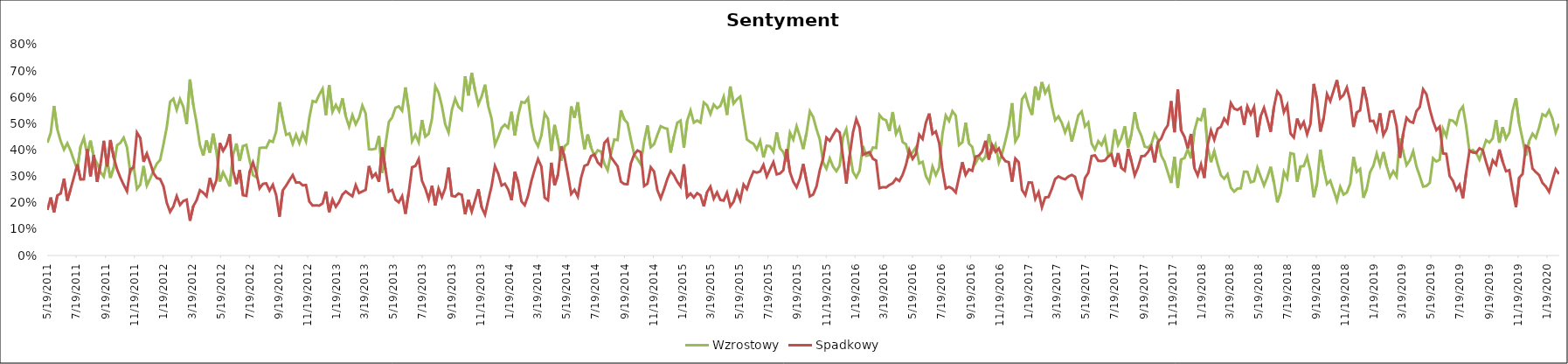
| Category | Wzrostowy | Spadkowy |
|---|---|---|
| 5/19/11 | 0.428 | 0.173 |
| 5/26/11 | 0.465 | 0.22 |
| 6/2/11 | 0.567 | 0.164 |
| 6/9/11 | 0.478 | 0.228 |
| 6/16/11 | 0.434 | 0.235 |
| 6/23/11 | 0.402 | 0.291 |
| 6/30/11 | 0.426 | 0.208 |
| 7/7/11 | 0.397 | 0.252 |
| 7/14/11 | 0.36 | 0.297 |
| 7/21/11 | 0.327 | 0.346 |
| 7/28/11 | 0.413 | 0.288 |
| 8/4/11 | 0.446 | 0.289 |
| 8/11/11 | 0.382 | 0.403 |
| 8/18/11 | 0.436 | 0.3 |
| 8/25/11 | 0.372 | 0.38 |
| 9/1/11 | 0.349 | 0.279 |
| 9/8/11 | 0.317 | 0.345 |
| 9/15/11 | 0.299 | 0.435 |
| 9/22/11 | 0.358 | 0.338 |
| 9/29/11 | 0.295 | 0.438 |
| 10/6/11 | 0.333 | 0.372 |
| 10/13/11 | 0.418 | 0.328 |
| 10/20/11 | 0.427 | 0.295 |
| 10/27/11 | 0.447 | 0.268 |
| 11/3/11 | 0.41 | 0.244 |
| 11/10/11 | 0.315 | 0.327 |
| 11/17/11 | 0.34 | 0.334 |
| 11/24/11 | 0.252 | 0.466 |
| 12/1/11 | 0.269 | 0.446 |
| 12/8/11 | 0.34 | 0.355 |
| 12/15/11 | 0.265 | 0.387 |
| 12/22/11 | 0.292 | 0.351 |
| 12/29/11 | 0.322 | 0.312 |
| 1/5/12 | 0.348 | 0.294 |
| 1/12/12 | 0.363 | 0.29 |
| 1/19/12 | 0.422 | 0.263 |
| 1/26/12 | 0.487 | 0.2 |
| 2/2/12 | 0.583 | 0.166 |
| 2/9/12 | 0.595 | 0.186 |
| 2/16/12 | 0.553 | 0.225 |
| 2/23/12 | 0.593 | 0.192 |
| 3/1/12 | 0.564 | 0.207 |
| 3/8/12 | 0.498 | 0.212 |
| 3/15/12 | 0.668 | 0.132 |
| 3/22/12 | 0.571 | 0.187 |
| 3/29/12 | 0.503 | 0.21 |
| 4/5/12 | 0.419 | 0.248 |
| 4/12/12 | 0.379 | 0.238 |
| 4/19/12 | 0.436 | 0.225 |
| 4/26/12 | 0.39 | 0.294 |
| 5/3/12 | 0.462 | 0.252 |
| 5/10/12 | 0.393 | 0.286 |
| 5/17/12 | 0.28 | 0.427 |
| 5/24/12 | 0.316 | 0.397 |
| 5/31/12 | 0.291 | 0.419 |
| 6/7/12 | 0.262 | 0.46 |
| 6/14/12 | 0.382 | 0.324 |
| 6/21/12 | 0.425 | 0.271 |
| 6/28/12 | 0.359 | 0.324 |
| 7/5/12 | 0.415 | 0.229 |
| 7/12/12 | 0.42 | 0.226 |
| 7/19/12 | 0.36 | 0.318 |
| 7/26/12 | 0.305 | 0.353 |
| 8/2/12 | 0.297 | 0.314 |
| 8/9/12 | 0.408 | 0.255 |
| 8/16/12 | 0.409 | 0.272 |
| 8/23/12 | 0.409 | 0.274 |
| 8/30/12 | 0.436 | 0.246 |
| 9/6/12 | 0.431 | 0.268 |
| 9/13/12 | 0.47 | 0.229 |
| 9/20/12 | 0.582 | 0.147 |
| 9/27/12 | 0.517 | 0.247 |
| 10/4/12 | 0.458 | 0.265 |
| 10/11/12 | 0.463 | 0.286 |
| 10/18/12 | 0.424 | 0.305 |
| 10/25/12 | 0.458 | 0.277 |
| 11/1/12 | 0.426 | 0.278 |
| 11/8/12 | 0.464 | 0.266 |
| 11/15/12 | 0.433 | 0.267 |
| 11/22/12 | 0.522 | 0.205 |
| 11/29/12 | 0.586 | 0.189 |
| 12/6/12 | 0.582 | 0.19 |
| 12/13/12 | 0.61 | 0.189 |
| 12/20/12 | 0.632 | 0.198 |
| 12/27/12 | 0.533 | 0.243 |
| 1/3/13 | 0.647 | 0.165 |
| 1/10/13 | 0.545 | 0.212 |
| 1/17/13 | 0.571 | 0.185 |
| 1/24/13 | 0.548 | 0.203 |
| 1/31/13 | 0.596 | 0.231 |
| 2/7/13 | 0.528 | 0.243 |
| 2/14/13 | 0.489 | 0.233 |
| 2/21/13 | 0.533 | 0.225 |
| 2/28/13 | 0.498 | 0.267 |
| 3/7/13 | 0.522 | 0.237 |
| 3/14/13 | 0.569 | 0.243 |
| 3/21/13 | 0.539 | 0.249 |
| 3/28/13 | 0.403 | 0.34 |
| 4/4/13 | 0.402 | 0.297 |
| 4/11/13 | 0.406 | 0.311 |
| 4/18/13 | 0.453 | 0.28 |
| 4/25/13 | 0.313 | 0.41 |
| 5/2/13 | 0.422 | 0.325 |
| 5/9/13 | 0.507 | 0.242 |
| 5/16/13 | 0.524 | 0.249 |
| 5/23/13 | 0.561 | 0.212 |
| 5/30/13 | 0.566 | 0.202 |
| 6/6/13 | 0.549 | 0.225 |
| 6/13/13 | 0.638 | 0.158 |
| 6/20/13 | 0.553 | 0.24 |
| 6/27/13 | 0.433 | 0.335 |
| 7/4/13 | 0.458 | 0.34 |
| 7/11/13 | 0.429 | 0.366 |
| 7/18/13 | 0.514 | 0.283 |
| 7/25/13 | 0.451 | 0.254 |
| 8/1/13 | 0.462 | 0.214 |
| 8/8/13 | 0.519 | 0.265 |
| 8/15/13 | 0.642 | 0.19 |
| 8/22/13 | 0.618 | 0.253 |
| 8/29/13 | 0.567 | 0.221 |
| 9/5/13 | 0.498 | 0.255 |
| 9/12/13 | 0.467 | 0.333 |
| 9/19/13 | 0.552 | 0.226 |
| 9/26/13 | 0.595 | 0.224 |
| 10/3/13 | 0.564 | 0.235 |
| 10/10/13 | 0.552 | 0.23 |
| 10/17/13 | 0.68 | 0.156 |
| 10/24/13 | 0.607 | 0.211 |
| 10/31/13 | 0.693 | 0.167 |
| 11/7/13 | 0.627 | 0.209 |
| 11/14/13 | 0.573 | 0.252 |
| 11/21/13 | 0.604 | 0.182 |
| 11/28/13 | 0.648 | 0.155 |
| 12/5/13 | 0.566 | 0.211 |
| 12/12/13 | 0.519 | 0.264 |
| 12/19/13 | 0.42 | 0.339 |
| 12/26/13 | 0.45 | 0.31 |
| 1/2/14 | 0.484 | 0.266 |
| 1/9/14 | 0.497 | 0.272 |
| 1/16/14 | 0.484 | 0.25 |
| 1/23/14 | 0.545 | 0.21 |
| 1/30/14 | 0.455 | 0.317 |
| 2/6/14 | 0.531 | 0.278 |
| 2/13/14 | 0.582 | 0.205 |
| 2/20/14 | 0.579 | 0.191 |
| 2/27/14 | 0.597 | 0.227 |
| 3/6/14 | 0.498 | 0.283 |
| 3/13/14 | 0.439 | 0.327 |
| 3/20/14 | 0.415 | 0.366 |
| 3/27/14 | 0.455 | 0.337 |
| 4/3/14 | 0.539 | 0.219 |
| 4/10/14 | 0.519 | 0.21 |
| 4/17/14 | 0.397 | 0.352 |
| 4/24/14 | 0.495 | 0.266 |
| 5/1/14 | 0.437 | 0.306 |
| 5/8/14 | 0.359 | 0.415 |
| 5/15/14 | 0.414 | 0.374 |
| 5/22/14 | 0.425 | 0.307 |
| 5/29/14 | 0.566 | 0.234 |
| 6/5/14 | 0.522 | 0.249 |
| 6/12/14 | 0.581 | 0.224 |
| 6/19/14 | 0.482 | 0.295 |
| 6/26/14 | 0.403 | 0.34 |
| 7/3/14 | 0.459 | 0.345 |
| 7/10/14 | 0.41 | 0.377 |
| 7/17/14 | 0.379 | 0.383 |
| 7/24/14 | 0.399 | 0.353 |
| 7/31/14 | 0.394 | 0.34 |
| 8/7/14 | 0.348 | 0.427 |
| 8/14/14 | 0.324 | 0.441 |
| 8/21/14 | 0.386 | 0.373 |
| 8/28/14 | 0.44 | 0.356 |
| 9/4/14 | 0.438 | 0.338 |
| 9/11/14 | 0.551 | 0.28 |
| 9/18/14 | 0.516 | 0.271 |
| 9/25/14 | 0.502 | 0.271 |
| 10/2/14 | 0.441 | 0.349 |
| 10/9/14 | 0.383 | 0.383 |
| 10/16/14 | 0.366 | 0.398 |
| 10/23/14 | 0.345 | 0.392 |
| 10/30/14 | 0.433 | 0.264 |
| 11/6/14 | 0.494 | 0.272 |
| 11/13/14 | 0.411 | 0.335 |
| 11/20/14 | 0.422 | 0.319 |
| 11/27/14 | 0.457 | 0.248 |
| 12/4/14 | 0.49 | 0.217 |
| 12/11/14 | 0.484 | 0.251 |
| 12/18/14 | 0.481 | 0.29 |
| 12/25/14 | 0.39 | 0.32 |
| 1/1/15 | 0.451 | 0.304 |
| 1/8/15 | 0.503 | 0.28 |
| 1/15/15 | 0.512 | 0.262 |
| 1/22/15 | 0.409 | 0.346 |
| 1/29/15 | 0.511 | 0.222 |
| 2/5/15 | 0.55 | 0.235 |
| 2/12/15 | 0.504 | 0.22 |
| 2/19/15 | 0.512 | 0.236 |
| 2/26/15 | 0.504 | 0.228 |
| 3/5/15 | 0.581 | 0.186 |
| 3/12/15 | 0.57 | 0.241 |
| 3/19/15 | 0.537 | 0.261 |
| 3/26/15 | 0.573 | 0.216 |
| 4/2/15 | 0.559 | 0.239 |
| 4/9/15 | 0.568 | 0.211 |
| 4/16/15 | 0.602 | 0.208 |
| 4/23/15 | 0.533 | 0.238 |
| 4/30/15 | 0.641 | 0.187 |
| 5/7/15 | 0.577 | 0.204 |
| 5/14/15 | 0.593 | 0.243 |
| 5/21/15 | 0.603 | 0.21 |
| 5/28/15 | 0.521 | 0.269 |
| 6/4/15 | 0.44 | 0.252 |
| 6/11/15 | 0.431 | 0.29 |
| 6/18/15 | 0.424 | 0.319 |
| 6/25/15 | 0.403 | 0.314 |
| 7/2/15 | 0.435 | 0.319 |
| 7/9/15 | 0.372 | 0.344 |
| 7/16/15 | 0.416 | 0.3 |
| 7/23/15 | 0.415 | 0.327 |
| 7/30/15 | 0.393 | 0.354 |
| 8/6/15 | 0.467 | 0.308 |
| 8/13/15 | 0.407 | 0.311 |
| 8/20/15 | 0.392 | 0.324 |
| 8/27/15 | 0.357 | 0.403 |
| 9/3/15 | 0.466 | 0.316 |
| 9/10/15 | 0.44 | 0.28 |
| 9/17/15 | 0.49 | 0.259 |
| 9/24/15 | 0.451 | 0.292 |
| 10/1/15 | 0.404 | 0.347 |
| 10/8/15 | 0.466 | 0.283 |
| 10/15/15 | 0.547 | 0.224 |
| 10/22/15 | 0.525 | 0.231 |
| 10/29/15 | 0.479 | 0.262 |
| 11/5/15 | 0.44 | 0.324 |
| 11/12/15 | 0.354 | 0.369 |
| 11/19/15 | 0.329 | 0.447 |
| 11/26/15 | 0.369 | 0.435 |
| 12/3/15 | 0.337 | 0.457 |
| 12/10/15 | 0.32 | 0.478 |
| 12/17/15 | 0.341 | 0.466 |
| 12/24/15 | 0.449 | 0.374 |
| 12/31/15 | 0.479 | 0.273 |
| 1/7/16 | 0.398 | 0.378 |
| 1/14/16 | 0.317 | 0.466 |
| 1/21/16 | 0.297 | 0.517 |
| 1/28/16 | 0.322 | 0.485 |
| 2/4/16 | 0.415 | 0.382 |
| 2/11/16 | 0.378 | 0.388 |
| 2/18/16 | 0.381 | 0.392 |
| 2/25/16 | 0.41 | 0.367 |
| 3/3/16 | 0.408 | 0.36 |
| 3/10/16 | 0.533 | 0.256 |
| 3/17/16 | 0.518 | 0.259 |
| 3/24/16 | 0.513 | 0.258 |
| 3/31/16 | 0.472 | 0.268 |
| 4/7/16 | 0.544 | 0.274 |
| 4/14/16 | 0.461 | 0.292 |
| 4/21/16 | 0.485 | 0.283 |
| 4/28/16 | 0.43 | 0.307 |
| 5/5/16 | 0.422 | 0.343 |
| 5/12/16 | 0.375 | 0.399 |
| 5/19/16 | 0.392 | 0.367 |
| 5/26/16 | 0.411 | 0.386 |
| 6/2/16 | 0.349 | 0.458 |
| 6/9/16 | 0.355 | 0.442 |
| 6/16/16 | 0.302 | 0.504 |
| 6/23/16 | 0.278 | 0.538 |
| 6/30/16 | 0.337 | 0.461 |
| 7/7/16 | 0.305 | 0.471 |
| 7/14/16 | 0.333 | 0.428 |
| 7/21/16 | 0.462 | 0.327 |
| 7/28/16 | 0.531 | 0.254 |
| 8/4/16 | 0.51 | 0.26 |
| 8/11/16 | 0.548 | 0.253 |
| 8/18/16 | 0.531 | 0.239 |
| 8/25/16 | 0.419 | 0.297 |
| 9/1/16 | 0.429 | 0.354 |
| 9/8/16 | 0.504 | 0.306 |
| 9/15/16 | 0.424 | 0.327 |
| 9/22/16 | 0.412 | 0.321 |
| 9/29/16 | 0.351 | 0.375 |
| 10/6/16 | 0.375 | 0.379 |
| 10/13/16 | 0.36 | 0.395 |
| 10/20/16 | 0.375 | 0.435 |
| 10/27/16 | 0.461 | 0.364 |
| 11/3/16 | 0.396 | 0.419 |
| 11/10/16 | 0.421 | 0.394 |
| 11/17/16 | 0.353 | 0.406 |
| 11/24/16 | 0.387 | 0.374 |
| 12/1/16 | 0.436 | 0.358 |
| 12/8/16 | 0.491 | 0.354 |
| 12/15/16 | 0.578 | 0.28 |
| 12/22/16 | 0.433 | 0.368 |
| 12/29/16 | 0.455 | 0.354 |
| 1/5/17 | 0.593 | 0.249 |
| 1/12/17 | 0.611 | 0.229 |
| 1/19/17 | 0.566 | 0.277 |
| 1/26/17 | 0.533 | 0.277 |
| 2/2/17 | 0.641 | 0.215 |
| 2/9/17 | 0.59 | 0.24 |
| 2/16/17 | 0.658 | 0.183 |
| 2/23/17 | 0.616 | 0.22 |
| 3/2/17 | 0.639 | 0.222 |
| 3/9/17 | 0.568 | 0.253 |
| 3/16/17 | 0.513 | 0.29 |
| 3/23/17 | 0.528 | 0.3 |
| 3/30/17 | 0.503 | 0.293 |
| 4/6/17 | 0.467 | 0.289 |
| 4/13/17 | 0.498 | 0.3 |
| 4/20/17 | 0.432 | 0.306 |
| 4/27/17 | 0.481 | 0.298 |
| 5/4/17 | 0.532 | 0.252 |
| 5/11/17 | 0.546 | 0.223 |
| 5/18/17 | 0.49 | 0.294 |
| 5/25/17 | 0.505 | 0.314 |
| 6/1/17 | 0.425 | 0.377 |
| 6/8/17 | 0.402 | 0.38 |
| 6/15/17 | 0.434 | 0.359 |
| 6/22/17 | 0.419 | 0.358 |
| 6/29/17 | 0.447 | 0.361 |
| 7/6/17 | 0.379 | 0.375 |
| 7/13/17 | 0.391 | 0.384 |
| 7/20/17 | 0.479 | 0.336 |
| 7/27/17 | 0.42 | 0.389 |
| 8/3/17 | 0.445 | 0.332 |
| 8/10/17 | 0.49 | 0.322 |
| 8/17/17 | 0.409 | 0.405 |
| 8/24/17 | 0.46 | 0.358 |
| 8/31/17 | 0.544 | 0.304 |
| 9/7/17 | 0.482 | 0.335 |
| 9/14/17 | 0.455 | 0.377 |
| 9/21/17 | 0.413 | 0.378 |
| 9/28/17 | 0.409 | 0.392 |
| 10/5/17 | 0.422 | 0.414 |
| 10/12/17 | 0.462 | 0.353 |
| 10/19/17 | 0.439 | 0.43 |
| 10/26/17 | 0.379 | 0.444 |
| 11/2/17 | 0.355 | 0.475 |
| 11/9/17 | 0.315 | 0.494 |
| 11/16/17 | 0.275 | 0.586 |
| 11/23/17 | 0.375 | 0.467 |
| 11/30/17 | 0.257 | 0.63 |
| 12/7/17 | 0.364 | 0.475 |
| 12/14/17 | 0.369 | 0.451 |
| 12/21/17 | 0.403 | 0.407 |
| 12/28/17 | 0.368 | 0.461 |
| 1/4/18 | 0.473 | 0.332 |
| 1/11/18 | 0.519 | 0.304 |
| 1/18/18 | 0.513 | 0.346 |
| 1/25/18 | 0.559 | 0.294 |
| 2/1/18 | 0.412 | 0.421 |
| 2/8/18 | 0.354 | 0.474 |
| 2/15/18 | 0.396 | 0.439 |
| 2/22/18 | 0.347 | 0.481 |
| 3/1/18 | 0.305 | 0.488 |
| 3/8/18 | 0.291 | 0.52 |
| 3/15/18 | 0.308 | 0.502 |
| 3/22/18 | 0.257 | 0.578 |
| 3/29/18 | 0.242 | 0.557 |
| 4/5/18 | 0.254 | 0.552 |
| 4/12/18 | 0.255 | 0.561 |
| 4/19/18 | 0.318 | 0.496 |
| 4/26/18 | 0.317 | 0.565 |
| 5/3/18 | 0.278 | 0.535 |
| 5/10/18 | 0.282 | 0.564 |
| 5/17/18 | 0.333 | 0.449 |
| 5/24/18 | 0.299 | 0.529 |
| 5/31/18 | 0.266 | 0.56 |
| 6/7/18 | 0.297 | 0.517 |
| 6/14/18 | 0.336 | 0.469 |
| 6/21/18 | 0.277 | 0.562 |
| 6/28/18 | 0.202 | 0.622 |
| 7/5/18 | 0.238 | 0.606 |
| 7/12/18 | 0.317 | 0.543 |
| 7/19/18 | 0.293 | 0.57 |
| 7/26/18 | 0.388 | 0.463 |
| 8/2/18 | 0.385 | 0.448 |
| 8/9/18 | 0.279 | 0.52 |
| 8/16/18 | 0.338 | 0.484 |
| 8/23/18 | 0.339 | 0.507 |
| 8/30/18 | 0.374 | 0.46 |
| 9/6/18 | 0.32 | 0.498 |
| 9/13/18 | 0.221 | 0.651 |
| 9/20/18 | 0.273 | 0.59 |
| 9/27/18 | 0.402 | 0.47 |
| 10/4/18 | 0.329 | 0.521 |
| 10/11/18 | 0.271 | 0.612 |
| 10/18/18 | 0.284 | 0.585 |
| 10/25/18 | 0.247 | 0.626 |
| 11/1/18 | 0.209 | 0.665 |
| 11/8/18 | 0.26 | 0.596 |
| 11/15/18 | 0.231 | 0.609 |
| 11/22/18 | 0.239 | 0.637 |
| 11/29/18 | 0.272 | 0.585 |
| 12/6/18 | 0.374 | 0.487 |
| 12/13/18 | 0.317 | 0.543 |
| 12/20/18 | 0.328 | 0.551 |
| 12/27/18 | 0.219 | 0.639 |
| 1/3/19 | 0.253 | 0.588 |
| 1/10/19 | 0.316 | 0.51 |
| 1/17/19 | 0.341 | 0.511 |
| 1/24/19 | 0.387 | 0.476 |
| 1/31/19 | 0.343 | 0.539 |
| 2/7/19 | 0.392 | 0.457 |
| 2/14/19 | 0.339 | 0.481 |
| 2/21/19 | 0.297 | 0.545 |
| 2/28/19 | 0.32 | 0.548 |
| 3/7/19 | 0.3 | 0.491 |
| 3/14/19 | 0.444 | 0.371 |
| 3/21/19 | 0.394 | 0.463 |
| 3/28/19 | 0.343 | 0.522 |
| 4/4/19 | 0.361 | 0.508 |
| 4/11/19 | 0.396 | 0.504 |
| 4/18/19 | 0.337 | 0.548 |
| 4/25/19 | 0.301 | 0.564 |
| 5/2/19 | 0.261 | 0.631 |
| 5/9/19 | 0.264 | 0.612 |
| 5/16/19 | 0.276 | 0.556 |
| 5/23/19 | 0.369 | 0.51 |
| 5/30/19 | 0.357 | 0.476 |
| 6/6/19 | 0.364 | 0.489 |
| 6/13/19 | 0.48 | 0.387 |
| 6/20/19 | 0.453 | 0.385 |
| 6/27/19 | 0.514 | 0.302 |
| 7/4/19 | 0.511 | 0.283 |
| 7/11/19 | 0.497 | 0.249 |
| 7/18/19 | 0.547 | 0.268 |
| 7/25/19 | 0.565 | 0.217 |
| 8/1/19 | 0.49 | 0.315 |
| 8/8/19 | 0.393 | 0.398 |
| 8/15/19 | 0.4 | 0.391 |
| 8/22/19 | 0.389 | 0.389 |
| 8/29/19 | 0.364 | 0.407 |
| 9/5/19 | 0.4 | 0.4 |
| 9/12/19 | 0.438 | 0.354 |
| 9/19/19 | 0.429 | 0.314 |
| 9/26/19 | 0.444 | 0.361 |
| 10/3/19 | 0.514 | 0.345 |
| 10/10/19 | 0.428 | 0.402 |
| 10/17/19 | 0.487 | 0.356 |
| 10/24/19 | 0.443 | 0.32 |
| 10/31/19 | 0.466 | 0.324 |
| 11/7/19 | 0.549 | 0.249 |
| 11/14/19 | 0.597 | 0.183 |
| 11/21/19 | 0.5 | 0.295 |
| 11/28/19 | 0.441 | 0.309 |
| 12/5/19 | 0.379 | 0.416 |
| 12/12/19 | 0.435 | 0.408 |
| 12/19/19 | 0.462 | 0.33 |
| 12/26/19 | 0.446 | 0.317 |
| 1/2/20 | 0.486 | 0.305 |
| 1/9/20 | 0.536 | 0.276 |
| 1/16/20 | 0.528 | 0.262 |
| 1/23/20 | 0.551 | 0.242 |
| 1/30/20 | 0.519 | 0.286 |
| 2/6/20 | 0.466 | 0.327 |
| 2/13/20 | 0.5 | 0.309 |